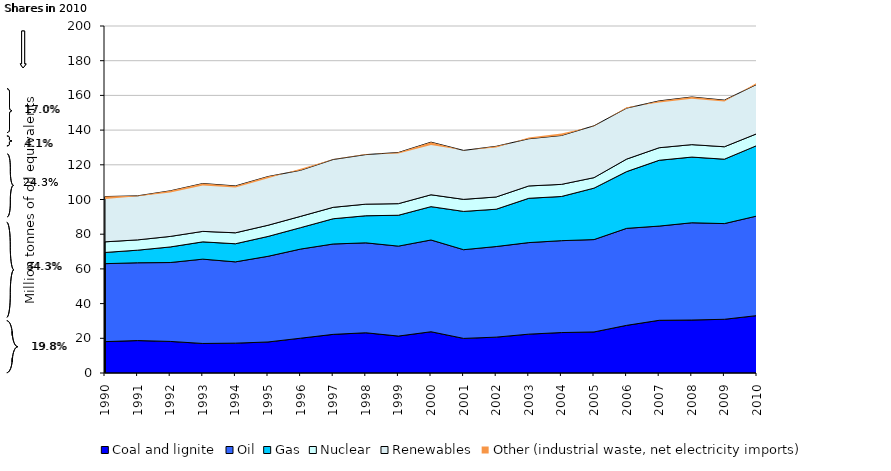
| Category | Coal and lignite | Oil | Gas | Nuclear | Renewables | Other (industrial waste, net electricity imports) |
|---|---|---|---|---|---|---|
| 1990.0 | 18.091 | 44.924 | 6.463 | 6.118 | 26.089 | -1.452 |
| 1991.0 | 18.694 | 44.84 | 7.252 | 5.943 | 25.39 | -0.259 |
| 1992.0 | 18.207 | 45.463 | 8.977 | 6.072 | 26.282 | -0.921 |
| 1993.0 | 17.027 | 48.598 | 9.956 | 6.047 | 27.588 | -1.078 |
| 1994.0 | 17.209 | 46.846 | 10.44 | 6.309 | 27.026 | -0.864 |
| 1995.0 | 17.879 | 49.385 | 11.444 | 6.446 | 28.078 | -1.052 |
| 1996.0 | 20.056 | 51.374 | 12.346 | 6.51 | 26.557 | 0.907 |
| 1997.0 | 22.263 | 52.093 | 14.557 | 6.578 | 27.558 | 0.191 |
| 1998.0 | 23.186 | 51.826 | 15.614 | 6.689 | 28.559 | 0.316 |
| 1999.0 | 21.283 | 51.836 | 17.795 | 6.69 | 29.494 | -0.646 |
| 2000.0 | 23.778 | 52.884 | 19.217 | 6.848 | 30.33 | -1.683 |
| 2001.0 | 19.946 | 51.122 | 22.067 | 6.944 | 28.215 | 0.046 |
| 2002.0 | 20.672 | 52.22 | 21.511 | 7.051 | 29.193 | -0.678 |
| 2003.0 | 22.396 | 52.761 | 25.539 | 7.117 | 27.186 | 0.746 |
| 2004.0 | 23.311 | 52.961 | 25.463 | 6.982 | 28.168 | 1.15 |
| 2005.0 | 23.661 | 53.236 | 29.647 | 6.047 | 29.888 | -0.292 |
| 2006.0 | 27.465 | 55.899 | 32.703 | 7.207 | 29.374 | 0.466 |
| 2007.0 | 30.369 | 54.311 | 37.927 | 7.234 | 26.995 | -0.871 |
| 2008.0 | 30.539 | 56.049 | 37.861 | 7.176 | 27.456 | -1.016 |
| 2009.0 | 30.961 | 55.159 | 37.106 | 7.173 | 26.871 | -0.753 |
| 2010.0 | 33.096 | 57.396 | 40.639 | 6.825 | 28.426 | 0.924 |